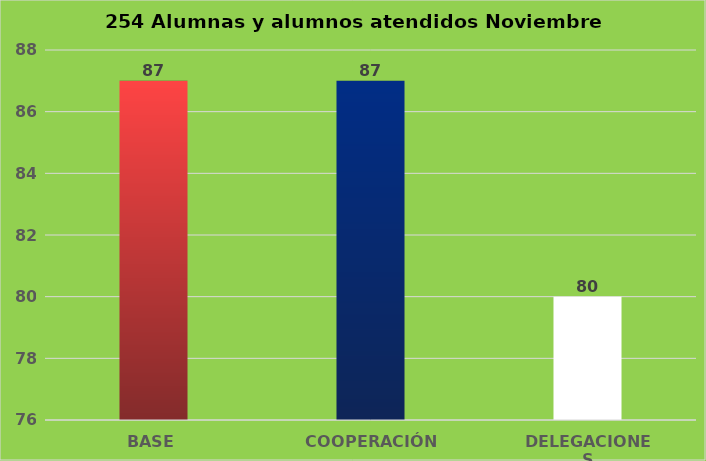
| Category | Series 0 |
|---|---|
| BASE | 87 |
| COOPERACIÓN | 87 |
| DELEGACIONES | 80 |